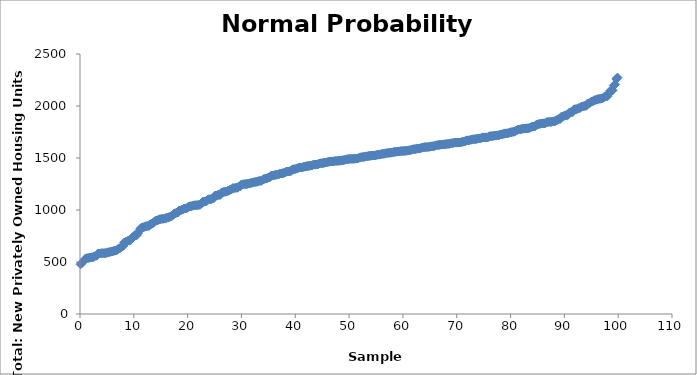
| Category | Series 0 |
|---|---|
| 0.11574074074074074 | 478 |
| 0.3472222222222222 | 490 |
| 0.5787037037037037 | 505 |
| 0.8101851851851851 | 517 |
| 1.0416666666666667 | 534 |
| 1.2731481481481481 | 536 |
| 1.5046296296296295 | 539 |
| 1.7361111111111112 | 540 |
| 1.9675925925925926 | 543 |
| 2.1990740740740744 | 545 |
| 2.430555555555556 | 546 |
| 2.662037037037037 | 554 |
| 2.8935185185185186 | 560 |
| 3.125 | 561 |
| 3.356481481481482 | 581 |
| 3.5879629629629632 | 582 |
| 3.8194444444444446 | 583 |
| 4.050925925925926 | 585 |
| 4.282407407407407 | 585 |
| 4.513888888888888 | 585 |
| 4.74537037037037 | 586 |
| 4.976851851851851 | 588 |
| 5.208333333333333 | 594 |
| 5.439814814814815 | 594 |
| 5.671296296296296 | 599 |
| 5.902777777777778 | 600 |
| 6.134259259259259 | 604 |
| 6.3657407407407405 | 608 |
| 6.597222222222222 | 610 |
| 6.828703703703703 | 614 |
| 7.060185185185185 | 623 |
| 7.291666666666666 | 630 |
| 7.523148148148148 | 636 |
| 7.75462962962963 | 650 |
| 7.986111111111111 | 652 |
| 8.217592592592592 | 687 |
| 8.449074074074074 | 694 |
| 8.680555555555555 | 695 |
| 8.912037037037036 | 704 |
| 9.143518518518519 | 708 |
| 9.375 | 711 |
| 9.606481481481481 | 723 |
| 9.837962962962962 | 740 |
| 10.069444444444445 | 753 |
| 10.300925925925926 | 754 |
| 10.532407407407407 | 757 |
| 10.76388888888889 | 777 |
| 10.99537037037037 | 798 |
| 11.226851851851851 | 820 |
| 11.458333333333334 | 831 |
| 11.689814814814815 | 833 |
| 11.921296296296296 | 837 |
| 12.152777777777777 | 843 |
| 12.38425925925926 | 844 |
| 12.61574074074074 | 847 |
| 12.847222222222221 | 848 |
| 13.078703703703704 | 863 |
| 13.310185185185185 | 866 |
| 13.541666666666666 | 873 |
| 13.773148148148149 | 885 |
| 14.00462962962963 | 896 |
| 14.23611111111111 | 898 |
| 14.467592592592592 | 902 |
| 14.699074074074074 | 910 |
| 14.930555555555555 | 911 |
| 15.162037037037036 | 915 |
| 15.393518518518519 | 915 |
| 15.625 | 917 |
| 15.856481481481481 | 921 |
| 16.087962962962962 | 923 |
| 16.319444444444443 | 927 |
| 16.550925925925927 | 931 |
| 16.78240740740741 | 936 |
| 17.01388888888889 | 940 |
| 17.24537037037037 | 951 |
| 17.47685185185185 | 965 |
| 17.708333333333332 | 969 |
| 17.939814814814813 | 973 |
| 18.171296296296298 | 976 |
| 18.40277777777778 | 994 |
| 18.63425925925926 | 996 |
| 18.86574074074074 | 1001 |
| 19.09722222222222 | 1005 |
| 19.328703703703702 | 1013 |
| 19.560185185185183 | 1014 |
| 19.791666666666668 | 1015 |
| 20.02314814814815 | 1025 |
| 20.25462962962963 | 1034 |
| 20.48611111111111 | 1036 |
| 20.71759259259259 | 1037 |
| 20.949074074074073 | 1041 |
| 21.180555555555557 | 1045 |
| 21.412037037037038 | 1046 |
| 21.64351851851852 | 1046 |
| 21.875 | 1047 |
| 22.10648148148148 | 1049 |
| 22.337962962962962 | 1051 |
| 22.569444444444443 | 1063 |
| 22.800925925925927 | 1079 |
| 23.03240740740741 | 1079 |
| 23.26388888888889 | 1083 |
| 23.49537037037037 | 1084 |
| 23.72685185185185 | 1099 |
| 23.958333333333332 | 1103 |
| 24.189814814814813 | 1103 |
| 24.421296296296298 | 1105 |
| 24.65277777777778 | 1110 |
| 24.88425925925926 | 1115 |
| 25.11574074074074 | 1139 |
| 25.34722222222222 | 1140 |
| 25.578703703703702 | 1144 |
| 25.810185185185183 | 1145 |
| 26.041666666666668 | 1145 |
| 26.27314814814815 | 1166 |
| 26.50462962962963 | 1171 |
| 26.73611111111111 | 1173 |
| 26.96759259259259 | 1176 |
| 27.199074074074073 | 1177 |
| 27.430555555555557 | 1183 |
| 27.662037037037038 | 1186 |
| 27.89351851851852 | 1196 |
| 28.125 | 1197 |
| 28.35648148148148 | 1210 |
| 28.587962962962962 | 1210 |
| 28.819444444444443 | 1212 |
| 29.050925925925927 | 1214 |
| 29.28240740740741 | 1214 |
| 29.51388888888889 | 1226 |
| 29.74537037037037 | 1227 |
| 29.97685185185185 | 1244 |
| 30.208333333333332 | 1246 |
| 30.439814814814813 | 1248 |
| 30.671296296296298 | 1249 |
| 30.90277777777778 | 1250 |
| 31.13425925925926 | 1251 |
| 31.36574074074074 | 1254 |
| 31.59722222222222 | 1258 |
| 31.828703703703702 | 1260 |
| 32.06018518518518 | 1264 |
| 32.291666666666664 | 1267 |
| 32.523148148148145 | 1269 |
| 32.754629629629626 | 1271 |
| 32.986111111111114 | 1272 |
| 33.217592592592595 | 1279 |
| 33.449074074074076 | 1280 |
| 33.68055555555556 | 1281 |
| 33.91203703703704 | 1289 |
| 34.14351851851852 | 1297 |
| 34.375 | 1300 |
| 34.60648148148148 | 1303 |
| 34.83796296296296 | 1306 |
| 35.06944444444444 | 1314 |
| 35.300925925925924 | 1316 |
| 35.532407407407405 | 1330 |
| 35.763888888888886 | 1331 |
| 35.995370370370374 | 1332 |
| 36.226851851851855 | 1337 |
| 36.458333333333336 | 1339 |
| 36.68981481481482 | 1341 |
| 36.9212962962963 | 1343 |
| 37.15277777777778 | 1350 |
| 37.38425925925926 | 1351 |
| 37.61574074074074 | 1354 |
| 37.84722222222222 | 1355 |
| 38.0787037037037 | 1360 |
| 38.31018518518518 | 1369 |
| 38.541666666666664 | 1369 |
| 38.773148148148145 | 1370 |
| 39.004629629629626 | 1372 |
| 39.236111111111114 | 1376 |
| 39.467592592592595 | 1390 |
| 39.699074074074076 | 1392 |
| 39.93055555555556 | 1392 |
| 40.16203703703704 | 1397 |
| 40.39351851851852 | 1400 |
| 40.625 | 1407 |
| 40.85648148148148 | 1409 |
| 41.08796296296296 | 1409 |
| 41.31944444444444 | 1410 |
| 41.550925925925924 | 1415 |
| 41.782407407407405 | 1416 |
| 42.013888888888886 | 1421 |
| 42.245370370370374 | 1422 |
| 42.476851851851855 | 1424 |
| 42.708333333333336 | 1425 |
| 42.93981481481482 | 1427 |
| 43.1712962962963 | 1431 |
| 43.40277777777778 | 1436 |
| 43.63425925925926 | 1437 |
| 43.86574074074074 | 1437 |
| 44.09722222222222 | 1439 |
| 44.3287037037037 | 1442 |
| 44.56018518518518 | 1448 |
| 44.791666666666664 | 1450 |
| 45.023148148148145 | 1450 |
| 45.254629629629626 | 1452 |
| 45.486111111111114 | 1455 |
| 45.717592592592595 | 1457 |
| 45.949074074074076 | 1461 |
| 46.18055555555556 | 1463 |
| 46.41203703703704 | 1465 |
| 46.64351851851852 | 1467 |
| 46.875 | 1467 |
| 47.10648148148148 | 1467 |
| 47.33796296296296 | 1471 |
| 47.56944444444444 | 1472 |
| 47.800925925925924 | 1472 |
| 48.032407407407405 | 1473 |
| 48.263888888888886 | 1474 |
| 48.495370370370374 | 1475 |
| 48.726851851851855 | 1478 |
| 48.958333333333336 | 1480 |
| 49.18981481481482 | 1482 |
| 49.4212962962963 | 1486 |
| 49.65277777777778 | 1489 |
| 49.88425925925926 | 1490 |
| 50.11574074074074 | 1491 |
| 50.34722222222222 | 1491 |
| 50.5787037037037 | 1492 |
| 50.81018518518518 | 1492 |
| 51.041666666666664 | 1493 |
| 51.273148148148145 | 1494 |
| 51.504629629629626 | 1495 |
| 51.736111111111114 | 1498 |
| 51.967592592592595 | 1504 |
| 52.199074074074076 | 1507 |
| 52.43055555555556 | 1510 |
| 52.66203703703704 | 1510 |
| 52.89351851851852 | 1511 |
| 53.125 | 1515 |
| 53.35648148148148 | 1516 |
| 53.58796296296296 | 1520 |
| 53.81944444444444 | 1520 |
| 54.050925925925924 | 1522 |
| 54.282407407407405 | 1523 |
| 54.513888888888886 | 1524 |
| 54.745370370370374 | 1525 |
| 54.976851851851855 | 1526 |
| 55.208333333333336 | 1532 |
| 55.43981481481482 | 1532 |
| 55.6712962962963 | 1533 |
| 55.90277777777778 | 1536 |
| 56.13425925925926 | 1540 |
| 56.36574074074074 | 1540 |
| 56.59722222222222 | 1541 |
| 56.8287037037037 | 1546 |
| 57.06018518518518 | 1547 |
| 57.291666666666664 | 1549 |
| 57.523148148148145 | 1551 |
| 57.754629629629626 | 1551 |
| 57.986111111111114 | 1553 |
| 58.217592592592595 | 1557 |
| 58.449074074074076 | 1559 |
| 58.68055555555556 | 1559 |
| 58.91203703703704 | 1562 |
| 59.14351851851852 | 1563 |
| 59.375 | 1564 |
| 59.60648148148148 | 1566 |
| 59.83796296296296 | 1567 |
| 60.06944444444444 | 1567 |
| 60.300925925925924 | 1568 |
| 60.532407407407405 | 1569 |
| 60.763888888888886 | 1570 |
| 60.995370370370374 | 1573 |
| 61.226851851851855 | 1575 |
| 61.458333333333336 | 1575 |
| 61.68981481481482 | 1582 |
| 61.9212962962963 | 1584 |
| 62.15277777777778 | 1586 |
| 62.38425925925926 | 1586 |
| 62.61574074074074 | 1590 |
| 62.84722222222222 | 1590 |
| 63.0787037037037 | 1592 |
| 63.31018518518518 | 1594 |
| 63.541666666666664 | 1600 |
| 63.773148148148145 | 1602 |
| 64.00462962962963 | 1604 |
| 64.23611111111111 | 1605 |
| 64.4675925925926 | 1605 |
| 64.69907407407408 | 1606 |
| 64.93055555555556 | 1608 |
| 65.16203703703704 | 1611 |
| 65.39351851851852 | 1612 |
| 65.62500000000001 | 1614 |
| 65.8564814814815 | 1614 |
| 66.08796296296298 | 1621 |
| 66.31944444444446 | 1623 |
| 66.55092592592594 | 1625 |
| 66.78240740740742 | 1626 |
| 67.0138888888889 | 1628 |
| 67.24537037037038 | 1629 |
| 67.47685185185186 | 1630 |
| 67.70833333333334 | 1632 |
| 67.93981481481482 | 1633 |
| 68.1712962962963 | 1635 |
| 68.40277777777779 | 1636 |
| 68.63425925925927 | 1636 |
| 68.86574074074075 | 1641 |
| 69.09722222222223 | 1642 |
| 69.32870370370371 | 1643 |
| 69.56018518518519 | 1648 |
| 69.79166666666667 | 1648 |
| 70.02314814814815 | 1648 |
| 70.25462962962963 | 1649 |
| 70.48611111111111 | 1649 |
| 70.7175925925926 | 1650 |
| 70.94907407407408 | 1655 |
| 71.18055555555556 | 1656 |
| 71.41203703703704 | 1660 |
| 71.64351851851852 | 1663 |
| 71.87500000000001 | 1669 |
| 72.1064814814815 | 1670 |
| 72.33796296296298 | 1670 |
| 72.56944444444446 | 1676 |
| 72.80092592592594 | 1676 |
| 73.03240740740742 | 1680 |
| 73.2638888888889 | 1681 |
| 73.49537037037038 | 1681 |
| 73.72685185185186 | 1684 |
| 73.95833333333334 | 1687 |
| 74.18981481481482 | 1688 |
| 74.4212962962963 | 1689 |
| 74.65277777777779 | 1695 |
| 74.88425925925927 | 1698 |
| 75.11574074074075 | 1698 |
| 75.34722222222223 | 1698 |
| 75.57870370370371 | 1698 |
| 75.81018518518519 | 1699 |
| 76.04166666666667 | 1708 |
| 76.27314814814815 | 1710 |
| 76.50462962962963 | 1710 |
| 76.73611111111111 | 1711 |
| 76.9675925925926 | 1715 |
| 77.19907407407408 | 1715 |
| 77.43055555555556 | 1717 |
| 77.66203703703704 | 1718 |
| 77.89351851851852 | 1720 |
| 78.12500000000001 | 1726 |
| 78.3564814814815 | 1726 |
| 78.58796296296298 | 1732 |
| 78.81944444444446 | 1733 |
| 79.05092592592594 | 1737 |
| 79.28240740740742 | 1737 |
| 79.5138888888889 | 1738 |
| 79.74537037037038 | 1743 |
| 79.97685185185186 | 1748 |
| 80.20833333333334 | 1748 |
| 80.43981481481482 | 1751 |
| 80.6712962962963 | 1753 |
| 80.90277777777779 | 1760 |
| 81.13425925925927 | 1764 |
| 81.36574074074075 | 1774 |
| 81.59722222222223 | 1774 |
| 81.82870370370371 | 1776 |
| 82.06018518518519 | 1778 |
| 82.29166666666667 | 1782 |
| 82.52314814814815 | 1782 |
| 82.75462962962963 | 1784 |
| 82.98611111111111 | 1785 |
| 83.2175925925926 | 1785 |
| 83.44907407407408 | 1788 |
| 83.68055555555556 | 1792 |
| 83.91203703703704 | 1800 |
| 84.14351851851852 | 1802 |
| 84.37500000000001 | 1804 |
| 84.6064814814815 | 1807 |
| 84.83796296296298 | 1821 |
| 85.06944444444446 | 1821 |
| 85.30092592592594 | 1828 |
| 85.53240740740742 | 1829 |
| 85.7638888888889 | 1832 |
| 85.99537037037038 | 1833 |
| 86.22685185185186 | 1833 |
| 86.45833333333334 | 1834 |
| 86.68981481481482 | 1843 |
| 86.9212962962963 | 1846 |
| 87.15277777777779 | 1847 |
| 87.38425925925927 | 1847 |
| 87.61574074074075 | 1848 |
| 87.84722222222223 | 1851 |
| 88.07870370370371 | 1853 |
| 88.31018518518519 | 1854 |
| 88.54166666666667 | 1864 |
| 88.77314814814815 | 1867 |
| 89.00462962962963 | 1876 |
| 89.23611111111111 | 1876 |
| 89.4675925925926 | 1897 |
| 89.69907407407408 | 1897 |
| 89.93055555555556 | 1905 |
| 90.16203703703704 | 1910 |
| 90.39351851851852 | 1911 |
| 90.62500000000001 | 1913 |
| 90.8564814814815 | 1933 |
| 91.08796296296298 | 1939 |
| 91.31944444444446 | 1942 |
| 91.55092592592594 | 1942 |
| 91.78240740740742 | 1967 |
| 92.0138888888889 | 1969 |
| 92.24537037037038 | 1970 |
| 92.47685185185186 | 1972 |
| 92.70833333333334 | 1981 |
| 92.93981481481482 | 1981 |
| 93.1712962962963 | 1994 |
| 93.40277777777779 | 1996 |
| 93.63425925925927 | 1998 |
| 93.86574074074075 | 2002 |
| 94.09722222222223 | 2003 |
| 94.32870370370371 | 2024 |
| 94.56018518518519 | 2025 |
| 94.79166666666667 | 2032 |
| 95.02314814814815 | 2042 |
| 95.25462962962963 | 2044 |
| 95.48611111111111 | 2054 |
| 95.7175925925926 | 2057 |
| 95.94907407407408 | 2061 |
| 96.18055555555556 | 2065 |
| 96.41203703703704 | 2068 |
| 96.64351851851852 | 2070 |
| 96.87500000000001 | 2072 |
| 97.1064814814815 | 2075 |
| 97.33796296296298 | 2083 |
| 97.56944444444446 | 2092 |
| 97.80092592592594 | 2094 |
| 98.03240740740742 | 2095 |
| 98.2638888888889 | 2119 |
| 98.49537037037038 | 2144 |
| 98.72685185185186 | 2147 |
| 98.95833333333334 | 2151 |
| 99.18981481481482 | 2197 |
| 99.4212962962963 | 2207 |
| 99.65277777777779 | 2260 |
| 99.88425925925927 | 2273 |